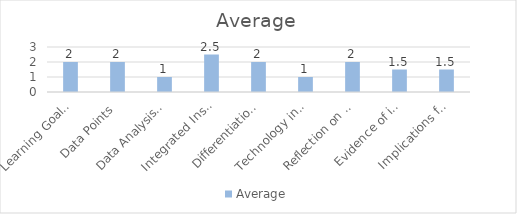
| Category | Average |
|---|---|
| Learning Goals Aligned with Pre-/Post-assessments ACEI 4.0 | 2 |
| Data Points | 2 |
| Data Analysis for Pedagogical Decisions ACEI 4.0 | 1 |
| Integrated Instruction ACEI 3.1 | 2.5 |
| Differentiation based on knowledge of individual learning ACEI 3.2 | 2 |
| Technology integration | 1 |
| Reflection on pedagogical decisions ACEI 1.0 | 2 |
| Evidence of impact on student learning ACEI 5.1 | 1.5 |
| Implications for teaching and professional development ACEI 5.1 | 1.5 |